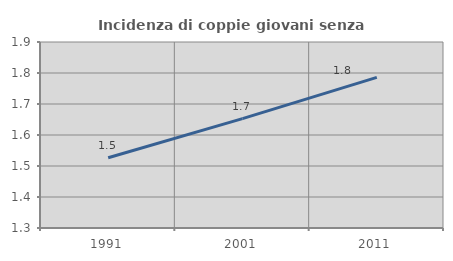
| Category | Incidenza di coppie giovani senza figli |
|---|---|
| 1991.0 | 1.527 |
| 2001.0 | 1.653 |
| 2011.0 | 1.786 |